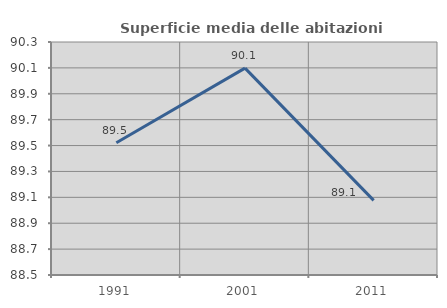
| Category | Superficie media delle abitazioni occupate |
|---|---|
| 1991.0 | 89.522 |
| 2001.0 | 90.098 |
| 2011.0 | 89.076 |